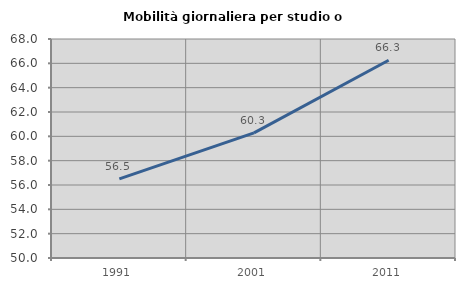
| Category | Mobilità giornaliera per studio o lavoro |
|---|---|
| 1991.0 | 56.507 |
| 2001.0 | 60.283 |
| 2011.0 | 66.258 |